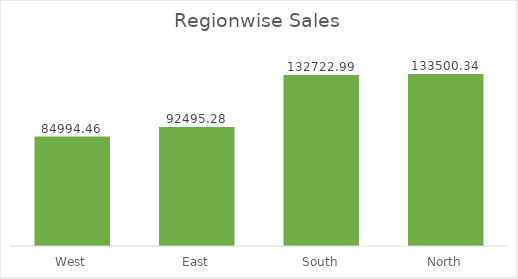
| Category | Total |
|---|---|
| West | 84994.46 |
| East | 92495.28 |
| South | 132722.99 |
| North | 133500.34 |